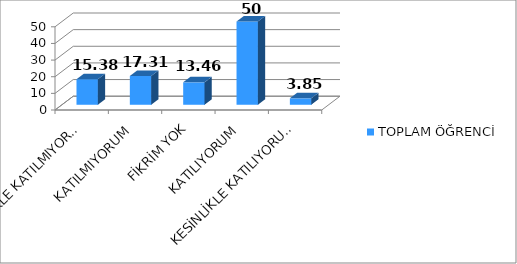
| Category | TOPLAM ÖĞRENCİ |
|---|---|
| KESİNLİKLE KATILMIYORUM | 15.38 |
| KATILMIYORUM | 17.31 |
| FİKRİM YOK | 13.46 |
| KATILIYORUM | 50 |
| KESİNLİKLE KATILIYORUM | 3.85 |